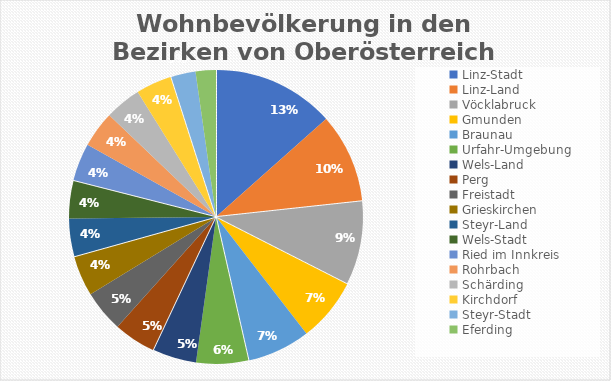
| Category | Series 0 |
|---|---|
| Linz-Stadt | 189889 |
| Linz-Land | 139116 |
| Vöcklabruck | 130316 |
| Gmunden | 99403 |
| Braunau | 97826 |
| Urfahr-Umgebung | 81400 |
| Wels-Land | 67945 |
| Perg | 65738 |
| Freistadt | 65113 |
| Grieskirchen | 62555 |
| Steyr-Land | 58700 |
| Wels-Stadt | 58591 |
| Ried im Innkreis | 58553 |
| Rohrbach | 56688 |
| Schärding | 56642 |
| Kirchdorf | 55557 |
| Steyr-Stadt | 38205 |
| Eferding | 31741 |